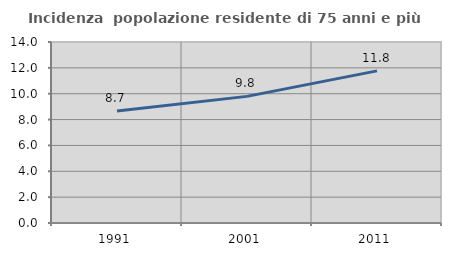
| Category | Incidenza  popolazione residente di 75 anni e più |
|---|---|
| 1991.0 | 8.665 |
| 2001.0 | 9.795 |
| 2011.0 | 11.765 |